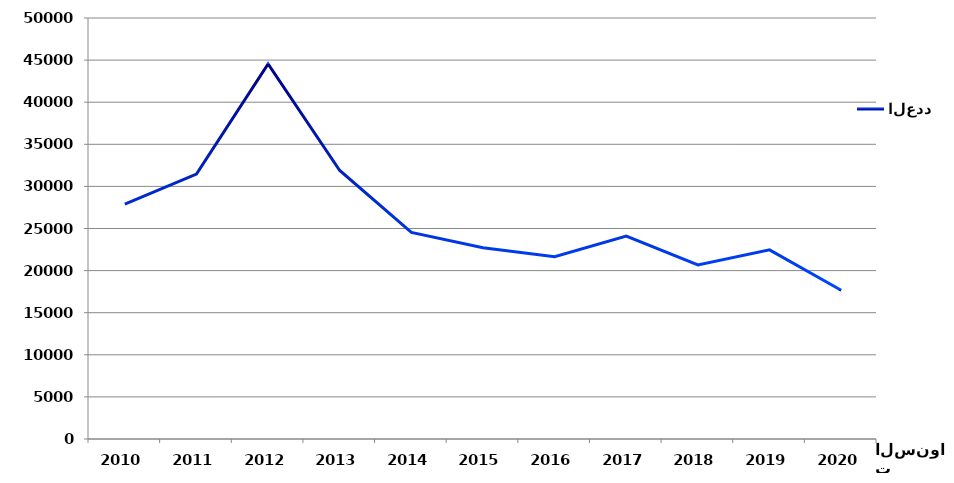
| Category | Series 0 | العدد |
|---|---|---|
| 2010.0 |  | 27907 |
| 2011.0 |  | 31460 |
| 2012.0 |  | 44550 |
| 2013.0 |  | 31892 |
| 2014.0 |  | 24537 |
| 2015.0 |  | 22716 |
| 2016.0 |  | 21653 |
| 2017.0 |  | 24107 |
| 2018.0 |  | 20676 |
| 2019.0 |  | 22464 |
| 2020.0 |  | 17665 |